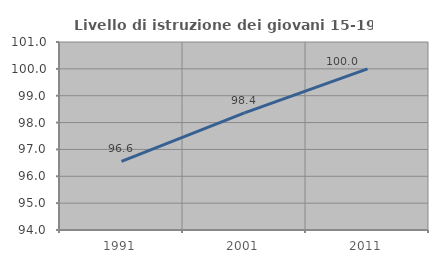
| Category | Livello di istruzione dei giovani 15-19 anni |
|---|---|
| 1991.0 | 96.552 |
| 2001.0 | 98.361 |
| 2011.0 | 100 |